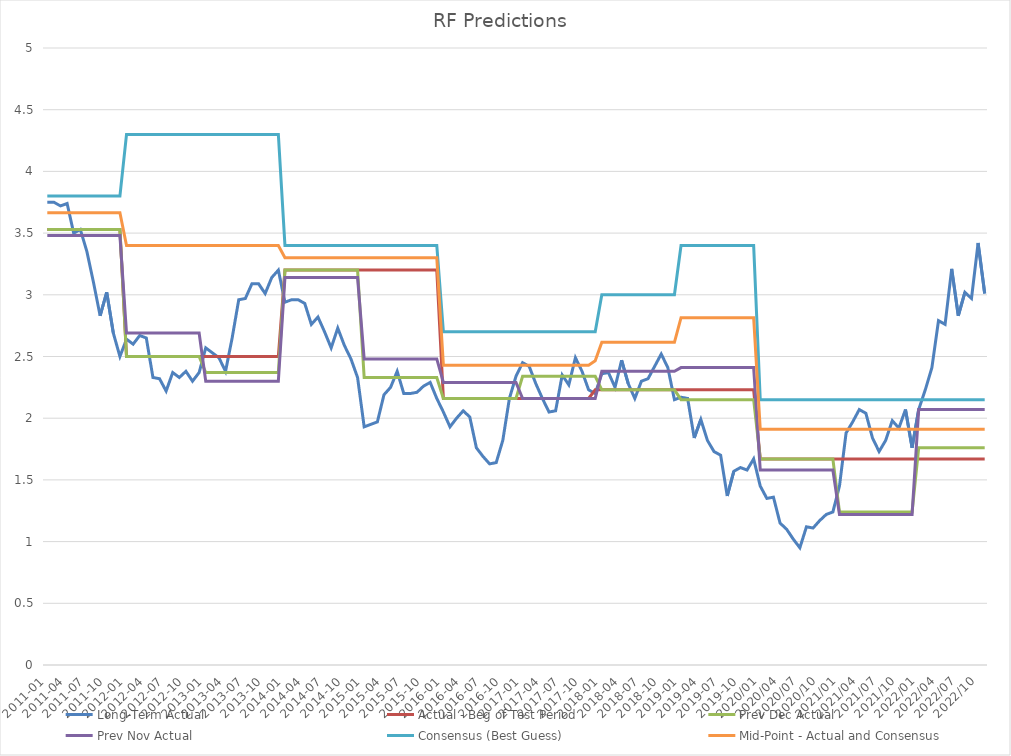
| Category | Long-Term Actual | Actual - Beg of Test Period | Prev Dec Actual | Prev Nov Actual | Consensus (Best Guess) | Mid-Point - Actual and Consensus |
|---|---|---|---|---|---|---|
| 2011-01 | 3.75 | 3.53 | 3.53 | 3.48 | 3.8 | 3.665 |
| 2011-02 | 3.75 | 3.53 | 3.53 | 3.48 | 3.8 | 3.665 |
| 2011-03 | 3.72 | 3.53 | 3.53 | 3.48 | 3.8 | 3.665 |
| 2011-04 | 3.74 | 3.53 | 3.53 | 3.48 | 3.8 | 3.665 |
| 2011-05 | 3.5 | 3.53 | 3.53 | 3.48 | 3.8 | 3.665 |
| 2011-06 | 3.53 | 3.53 | 3.53 | 3.48 | 3.8 | 3.665 |
| 2011-07 | 3.35 | 3.53 | 3.53 | 3.48 | 3.8 | 3.665 |
| 2011-08 | 3.1 | 3.53 | 3.53 | 3.48 | 3.8 | 3.665 |
| 2011-09 | 2.83 | 3.53 | 3.53 | 3.48 | 3.8 | 3.665 |
| 2011-10 | 3.02 | 3.53 | 3.53 | 3.48 | 3.8 | 3.665 |
| 2011-11 | 2.69 | 3.53 | 3.53 | 3.48 | 3.8 | 3.665 |
| 2011-12 | 2.5 | 3.53 | 3.53 | 3.48 | 3.8 | 3.665 |
| 2012-01 | 2.64 | 2.5 | 2.5 | 2.69 | 4.3 | 3.4 |
| 2012-02 | 2.6 | 2.5 | 2.5 | 2.69 | 4.3 | 3.4 |
| 2012-03 | 2.67 | 2.5 | 2.5 | 2.69 | 4.3 | 3.4 |
| 2012-04 | 2.65 | 2.5 | 2.5 | 2.69 | 4.3 | 3.4 |
| 2012-05 | 2.33 | 2.5 | 2.5 | 2.69 | 4.3 | 3.4 |
| 2012-06 | 2.32 | 2.5 | 2.5 | 2.69 | 4.3 | 3.4 |
| 2012-07 | 2.22 | 2.5 | 2.5 | 2.69 | 4.3 | 3.4 |
| 2012-08 | 2.37 | 2.5 | 2.5 | 2.69 | 4.3 | 3.4 |
| 2012-09 | 2.33 | 2.5 | 2.5 | 2.69 | 4.3 | 3.4 |
| 2012-10 | 2.38 | 2.5 | 2.5 | 2.69 | 4.3 | 3.4 |
| 2012-11 | 2.3 | 2.5 | 2.5 | 2.69 | 4.3 | 3.4 |
| 2012-12 | 2.37 | 2.5 | 2.5 | 2.69 | 4.3 | 3.4 |
| 2013-01 | 2.57 | 2.5 | 2.37 | 2.3 | 4.3 | 3.4 |
| 2013-02 | 2.53 | 2.5 | 2.37 | 2.3 | 4.3 | 3.4 |
| 2013-03 | 2.49 | 2.5 | 2.37 | 2.3 | 4.3 | 3.4 |
| 2013-04 | 2.38 | 2.5 | 2.37 | 2.3 | 4.3 | 3.4 |
| 2013-05 | 2.65 | 2.5 | 2.37 | 2.3 | 4.3 | 3.4 |
| 2013-06 | 2.96 | 2.5 | 2.37 | 2.3 | 4.3 | 3.4 |
| 2013-07 | 2.97 | 2.5 | 2.37 | 2.3 | 4.3 | 3.4 |
| 2013-08 | 3.09 | 2.5 | 2.37 | 2.3 | 4.3 | 3.4 |
| 2013-09 | 3.09 | 2.5 | 2.37 | 2.3 | 4.3 | 3.4 |
| 2013-10 | 3.01 | 2.5 | 2.37 | 2.3 | 4.3 | 3.4 |
| 2013-11 | 3.14 | 2.5 | 2.37 | 2.3 | 4.3 | 3.4 |
| 2013-12 | 3.2 | 2.5 | 2.37 | 2.3 | 4.3 | 3.4 |
| 2014-01 | 2.94 | 3.2 | 3.2 | 3.14 | 3.4 | 3.3 |
| 2014-02 | 2.96 | 3.2 | 3.2 | 3.14 | 3.4 | 3.3 |
| 2014-03 | 2.96 | 3.2 | 3.2 | 3.14 | 3.4 | 3.3 |
| 2014-04 | 2.93 | 3.2 | 3.2 | 3.14 | 3.4 | 3.3 |
| 2014-05 | 2.76 | 3.2 | 3.2 | 3.14 | 3.4 | 3.3 |
| 2014-06 | 2.82 | 3.2 | 3.2 | 3.14 | 3.4 | 3.3 |
| 2014-07 | 2.7 | 3.2 | 3.2 | 3.14 | 3.4 | 3.3 |
| 2014-08 | 2.57 | 3.2 | 3.2 | 3.14 | 3.4 | 3.3 |
| 2014-09 | 2.73 | 3.2 | 3.2 | 3.14 | 3.4 | 3.3 |
| 2014-10 | 2.59 | 3.2 | 3.2 | 3.14 | 3.4 | 3.3 |
| 2014-11 | 2.48 | 3.2 | 3.2 | 3.14 | 3.4 | 3.3 |
| 2014-12 | 2.33 | 3.2 | 3.2 | 3.14 | 3.4 | 3.3 |
| 2015-01 | 1.93 | 3.2 | 2.33 | 2.48 | 3.4 | 3.3 |
| 2015-02 | 1.95 | 3.2 | 2.33 | 2.48 | 3.4 | 3.3 |
| 2015-03 | 1.97 | 3.2 | 2.33 | 2.48 | 3.4 | 3.3 |
| 2015-04 | 2.19 | 3.2 | 2.33 | 2.48 | 3.4 | 3.3 |
| 2015-05 | 2.25 | 3.2 | 2.33 | 2.48 | 3.4 | 3.3 |
| 2015-06 | 2.38 | 3.2 | 2.33 | 2.48 | 3.4 | 3.3 |
| 2015-07 | 2.2 | 3.2 | 2.33 | 2.48 | 3.4 | 3.3 |
| 2015-08 | 2.2 | 3.2 | 2.33 | 2.48 | 3.4 | 3.3 |
| 2015-09 | 2.21 | 3.2 | 2.33 | 2.48 | 3.4 | 3.3 |
| 2015-10 | 2.26 | 3.2 | 2.33 | 2.48 | 3.4 | 3.3 |
| 2015-11 | 2.29 | 3.2 | 2.33 | 2.48 | 3.4 | 3.3 |
| 2015-12 | 2.16 | 3.2 | 2.33 | 2.48 | 3.4 | 3.3 |
| 2016-01 | 2.05 | 2.16 | 2.16 | 2.29 | 2.7 | 2.43 |
| 2016-02 | 1.93 | 2.16 | 2.16 | 2.29 | 2.7 | 2.43 |
| 2016-03 | 2 | 2.16 | 2.16 | 2.29 | 2.7 | 2.43 |
| 2016-04 | 2.06 | 2.16 | 2.16 | 2.29 | 2.7 | 2.43 |
| 2016-05 | 2.01 | 2.16 | 2.16 | 2.29 | 2.7 | 2.43 |
| 2016-06 | 1.76 | 2.16 | 2.16 | 2.29 | 2.7 | 2.43 |
| 2016-07 | 1.69 | 2.16 | 2.16 | 2.29 | 2.7 | 2.43 |
| 2016-08 | 1.63 | 2.16 | 2.16 | 2.29 | 2.7 | 2.43 |
| 2016-09 | 1.64 | 2.16 | 2.16 | 2.29 | 2.7 | 2.43 |
| 2016-10 | 1.82 | 2.16 | 2.16 | 2.29 | 2.7 | 2.43 |
| 2016-11 | 2.16 | 2.16 | 2.16 | 2.29 | 2.7 | 2.43 |
| 2016-12 | 2.34 | 2.16 | 2.16 | 2.29 | 2.7 | 2.43 |
| 2017-01 | 2.45 | 2.16 | 2.34 | 2.16 | 2.7 | 2.43 |
| 2017-02 | 2.42 | 2.16 | 2.34 | 2.16 | 2.7 | 2.43 |
| 2017-03 | 2.28 | 2.16 | 2.34 | 2.16 | 2.7 | 2.43 |
| 2017-04 | 2.16 | 2.16 | 2.34 | 2.16 | 2.7 | 2.43 |
| 2017-05 | 2.05 | 2.16 | 2.34 | 2.16 | 2.7 | 2.43 |
| 2017-06 | 2.06 | 2.16 | 2.34 | 2.16 | 2.7 | 2.43 |
| 2017-07 | 2.35 | 2.16 | 2.34 | 2.16 | 2.7 | 2.43 |
| 2017-08 | 2.27 | 2.16 | 2.34 | 2.16 | 2.7 | 2.43 |
| 2017-09 | 2.49 | 2.16 | 2.34 | 2.16 | 2.7 | 2.43 |
| 2017-10 | 2.38 | 2.16 | 2.34 | 2.16 | 2.7 | 2.43 |
| 2017-11 | 2.23 | 2.16 | 2.34 | 2.16 | 2.7 | 2.43 |
| 2017-12 | 2.2 | 2.23 | 2.34 | 2.16 | 2.7 | 2.465 |
| 2018-01 | 2.36 | 2.23 | 2.23 | 2.38 | 3 | 2.615 |
| 2018-02 | 2.37 | 2.23 | 2.23 | 2.38 | 3 | 2.615 |
| 2018-03 | 2.25 | 2.23 | 2.23 | 2.38 | 3 | 2.615 |
| 2018-04 | 2.47 | 2.23 | 2.23 | 2.38 | 3 | 2.615 |
| 2018-05 | 2.28 | 2.23 | 2.23 | 2.38 | 3 | 2.615 |
| 2018-06 | 2.16 | 2.23 | 2.23 | 2.38 | 3 | 2.615 |
| 2018-07 | 2.3 | 2.23 | 2.23 | 2.38 | 3 | 2.615 |
| 2018-08 | 2.32 | 2.23 | 2.23 | 2.38 | 3 | 2.615 |
| 2018-09 | 2.42 | 2.23 | 2.23 | 2.38 | 3 | 2.615 |
| 2018-10 | 2.52 | 2.23 | 2.23 | 2.38 | 3 | 2.615 |
| 2018-11 | 2.41 | 2.23 | 2.23 | 2.38 | 3 | 2.615 |
| 2018-12 | 2.15 | 2.23 | 2.23 | 2.38 | 3 | 2.615 |
| 2019-01 | 2.17 | 2.23 | 2.15 | 2.41 | 3.4 | 2.815 |
| 2019-02 | 2.16 | 2.23 | 2.15 | 2.41 | 3.4 | 2.815 |
| 2019-03 | 1.84 | 2.23 | 2.15 | 2.41 | 3.4 | 2.815 |
| 2019-04 | 1.99 | 2.23 | 2.15 | 2.41 | 3.4 | 2.815 |
| 2019-05 | 1.82 | 2.23 | 2.15 | 2.41 | 3.4 | 2.815 |
| 2019-06 | 1.73 | 2.23 | 2.15 | 2.41 | 3.4 | 2.815 |
| 2019-07 | 1.7 | 2.23 | 2.15 | 2.41 | 3.4 | 2.815 |
| 2019-08 | 1.37 | 2.23 | 2.15 | 2.41 | 3.4 | 2.815 |
| 2019-09 | 1.57 | 2.23 | 2.15 | 2.41 | 3.4 | 2.815 |
| 2019-10 | 1.6 | 2.23 | 2.15 | 2.41 | 3.4 | 2.815 |
| 2019-11 | 1.58 | 2.23 | 2.15 | 2.41 | 3.4 | 2.815 |
| 2019-12 | 1.67 | 2.23 | 2.15 | 2.41 | 3.4 | 2.815 |
| 2020/01 | 1.45 | 1.67 | 1.67 | 1.58 | 2.15 | 1.91 |
| 2020/02 | 1.35 | 1.67 | 1.67 | 1.58 | 2.15 | 1.91 |
| 2020/02 | 1.36 | 1.67 | 1.67 | 1.58 | 2.15 | 1.91 |
| 2020/04 | 1.15 | 1.67 | 1.67 | 1.58 | 2.15 | 1.91 |
| 2020/05 | 1.1 | 1.67 | 1.67 | 1.58 | 2.15 | 1.91 |
| 2020/06 | 1.02 | 1.67 | 1.67 | 1.58 | 2.15 | 1.91 |
| 2020/07 | 0.95 | 1.67 | 1.67 | 1.58 | 2.15 | 1.91 |
| 2020/08 | 1.12 | 1.67 | 1.67 | 1.58 | 2.15 | 1.91 |
| 2020/09 | 1.11 | 1.67 | 1.67 | 1.58 | 2.15 | 1.91 |
| 2020/10 | 1.17 | 1.67 | 1.67 | 1.58 | 2.15 | 1.91 |
| 2020/11 | 1.22 | 1.67 | 1.67 | 1.58 | 2.15 | 1.91 |
| 2020/12 | 1.24 | 1.67 | 1.67 | 1.58 | 2.15 | 1.91 |
| 2021/01 | 1.45 | 1.67 | 1.24 | 1.22 | 2.15 | 1.91 |
| 2021/02 | 1.88 | 1.67 | 1.24 | 1.22 | 2.15 | 1.91 |
| 2021/03 | 1.97 | 1.67 | 1.24 | 1.22 | 2.15 | 1.91 |
| 2021/04 | 2.07 | 1.67 | 1.24 | 1.22 | 2.15 | 1.91 |
| 2021/05 | 2.04 | 1.67 | 1.24 | 1.22 | 2.15 | 1.91 |
| 2021/06 | 1.84 | 1.67 | 1.24 | 1.22 | 2.15 | 1.91 |
| 2021/07 | 1.73 | 1.67 | 1.24 | 1.22 | 2.15 | 1.91 |
| 2021/08 | 1.82 | 1.67 | 1.24 | 1.22 | 2.15 | 1.91 |
| 2021/09 | 1.98 | 1.67 | 1.24 | 1.22 | 2.15 | 1.91 |
| 2021/10 | 1.92 | 1.67 | 1.24 | 1.22 | 2.15 | 1.91 |
| 2021/11 | 2.07 | 1.67 | 1.24 | 1.22 | 2.15 | 1.91 |
| 2021/12 | 1.76 | 1.67 | 1.24 | 1.22 | 2.15 | 1.91 |
| 2022/01 | 2.07 | 1.67 | 1.76 | 2.07 | 2.15 | 1.91 |
| 2022/02 | 2.23 | 1.67 | 1.76 | 2.07 | 2.15 | 1.91 |
| 2022/03 | 2.41 | 1.67 | 1.76 | 2.07 | 2.15 | 1.91 |
| 2022/04 | 2.79 | 1.67 | 1.76 | 2.07 | 2.15 | 1.91 |
| 2022/05 | 2.76 | 1.67 | 1.76 | 2.07 | 2.15 | 1.91 |
| 2022/06 | 3.21 | 1.67 | 1.76 | 2.07 | 2.15 | 1.91 |
| 2022/07 | 2.83 | 1.67 | 1.76 | 2.07 | 2.15 | 1.91 |
| 2022/08 | 3.02 | 1.67 | 1.76 | 2.07 | 2.15 | 1.91 |
| 2022/09 | 2.97 | 1.67 | 1.76 | 2.07 | 2.15 | 1.91 |
| 2022/10 | 3.42 | 1.67 | 1.76 | 2.07 | 2.15 | 1.91 |
| 2022/11 | 3.01 | 1.67 | 1.76 | 2.07 | 2.15 | 1.91 |